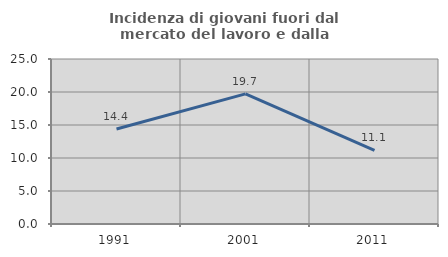
| Category | Incidenza di giovani fuori dal mercato del lavoro e dalla formazione  |
|---|---|
| 1991.0 | 14.4 |
| 2001.0 | 19.714 |
| 2011.0 | 11.146 |